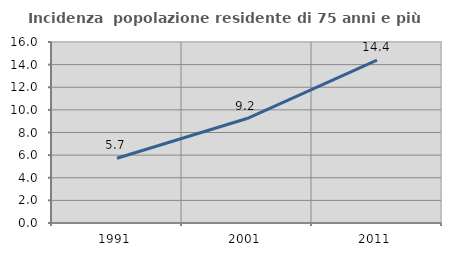
| Category | Incidenza  popolazione residente di 75 anni e più |
|---|---|
| 1991.0 | 5.722 |
| 2001.0 | 9.233 |
| 2011.0 | 14.387 |